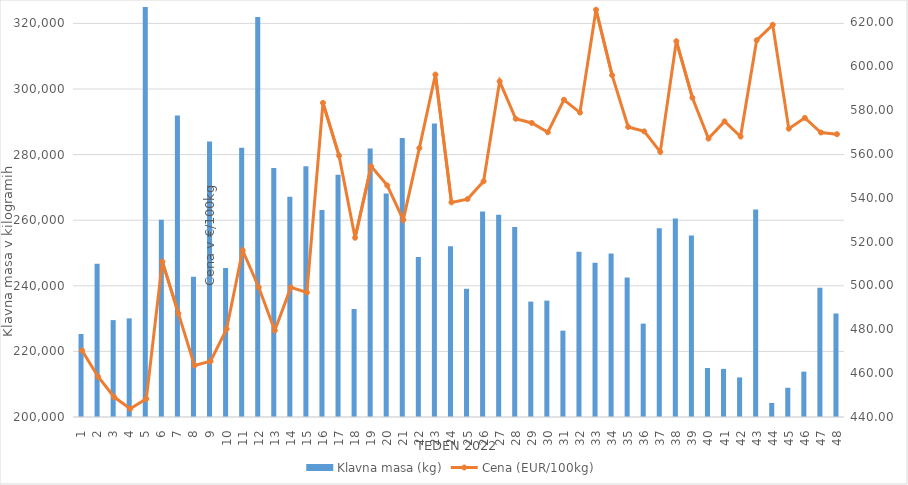
| Category | Klavna masa (kg) |
|---|---|
| 1.0 | 225300 |
| 2.0 | 246712 |
| 3.0 | 229541 |
| 4.0 | 230074 |
| 5.0 | 328640 |
| 6.0 | 260108 |
| 7.0 | 291887 |
| 8.0 | 242732 |
| 9.0 | 283987 |
| 10.0 | 245414 |
| 11.0 | 282092 |
| 12.0 | 321936 |
| 13.0 | 275950 |
| 14.0 | 267148 |
| 15.0 | 276417 |
| 16.0 | 263098 |
| 17.0 | 273824 |
| 18.0 | 232926 |
| 19.0 | 281859 |
| 20.0 | 268153 |
| 21.0 | 285073 |
| 22.0 | 248783 |
| 23.0 | 289478 |
| 24.0 | 252069 |
| 25.0 | 239099 |
| 26.0 | 262689 |
| 27.0 | 261656 |
| 28.0 | 257905 |
| 29.0 | 235185 |
| 30.0 | 235475 |
| 31.0 | 226322 |
| 32.0 | 250418 |
| 33.0 | 246996 |
| 34.0 | 249873 |
| 35.0 | 242516 |
| 36.0 | 228469 |
| 37.0 | 257511 |
| 38.0 | 260481 |
| 39.0 | 255370 |
| 40.0 | 214936 |
| 41.0 | 214672 |
| 42.0 | 212066 |
| 43.0 | 263287 |
| 44.0 | 204280 |
| 45.0 | 208920 |
| 46.0 | 213836 |
| 47.0 | 239417 |
| 48.0 | 231565 |